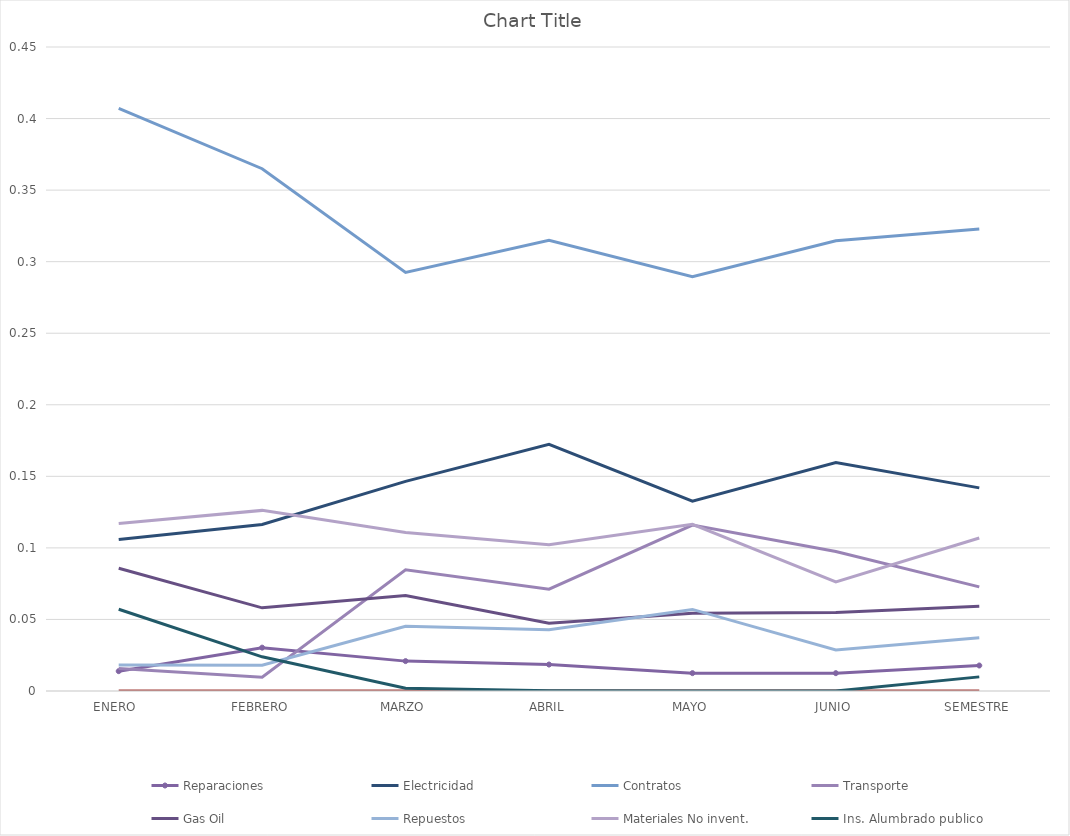
| Category | Reparaciones | Electricidad | Contratos | Transporte | BIENES DE CONSUMO | Gas Oil | Repuestos | Materiales No invent. | Ins. Alumbrado publico |
|---|---|---|---|---|---|---|---|---|---|
| ENERO  | 0.014 | 0.106 | 0.407 | 0.016 |  | 0.086 | 0.018 | 0.117 | 0.057 |
| FEBRERO | 0.03 | 0.116 | 0.365 | 0.01 |  | 0.058 | 0.018 | 0.126 | 0.024 |
| MARZO | 0.021 | 0.147 | 0.292 | 0.085 |  | 0.067 | 0.045 | 0.111 | 0.002 |
| ABRIL | 0.018 | 0.172 | 0.315 | 0.071 |  | 0.047 | 0.043 | 0.102 | 0 |
| MAYO | 0.012 | 0.133 | 0.289 | 0.116 |  | 0.054 | 0.057 | 0.116 | 0 |
| JUNIO | 0.012 | 0.16 | 0.315 | 0.097 |  | 0.055 | 0.029 | 0.076 | 0 |
| SEMESTRE | 0.018 | 0.142 | 0.323 | 0.073 |  | 0.059 | 0.037 | 0.107 | 0.01 |